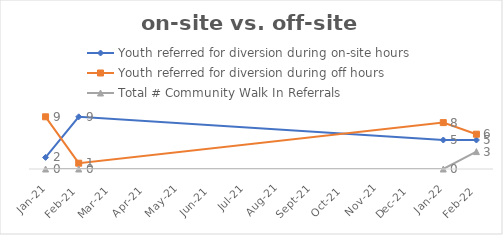
| Category | Youth referred for diversion during on-site hours | Youth referred for diversion during off hours | Total # Community Walk In Referrals |
|---|---|---|---|
| 2021-01-01 | 2 | 9 | 0 |
| 2021-02-01 | 9 | 1 | 0 |
| 2022-01-01 | 5 | 8 | 0 |
| 2022-02-01 | 5 | 6 | 3 |